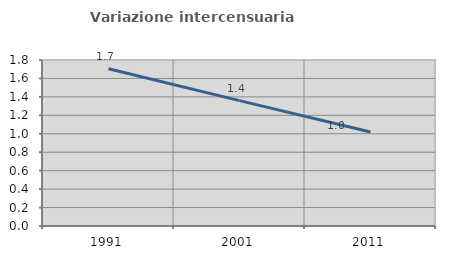
| Category | Variazione intercensuaria annua |
|---|---|
| 1991.0 | 1.705 |
| 2001.0 | 1.359 |
| 2011.0 | 1.019 |